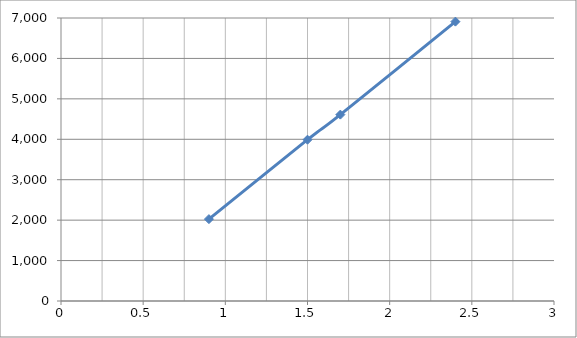
| Category | Series 0 |
|---|---|
| 0.9 | 2025 |
| 1.5 | 3990 |
| 1.7 | 4610 |
| 2.4 | 6910 |